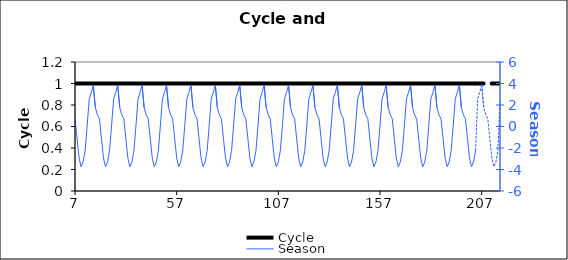
| Category | Cycle |
|---|---|
| 7.0 | 1 |
| 8.0 | 1 |
| 9.0 | 1 |
| 10.0 | 1 |
| 11.0 | 1 |
| 12.0 | 1 |
| 13.0 | 1 |
| 14.0 | 1 |
| 15.0 | 1 |
| 16.0 | 1 |
| 17.0 | 1 |
| 18.0 | 1 |
| 19.0 | 1 |
| 20.0 | 1 |
| 21.0 | 1 |
| 22.0 | 1 |
| 23.0 | 1 |
| 24.0 | 1 |
| 25.0 | 1 |
| 26.0 | 1 |
| 27.0 | 1 |
| 28.0 | 1 |
| 29.0 | 1 |
| 30.0 | 1 |
| 31.0 | 1 |
| 32.0 | 1 |
| 33.0 | 1 |
| 34.0 | 1 |
| 35.0 | 1 |
| 36.0 | 1 |
| 37.0 | 1 |
| 38.0 | 1 |
| 39.0 | 1 |
| 40.0 | 1 |
| 41.0 | 1 |
| 42.0 | 1 |
| 43.0 | 1 |
| 44.0 | 1 |
| 45.0 | 1 |
| 46.0 | 1 |
| 47.0 | 1 |
| 48.0 | 1 |
| 49.0 | 1 |
| 50.0 | 1 |
| 51.0 | 1 |
| 52.0 | 1 |
| 53.0 | 1 |
| 54.0 | 1 |
| 55.0 | 1 |
| 56.0 | 1 |
| 57.0 | 1 |
| 58.0 | 1 |
| 59.0 | 1 |
| 60.0 | 1 |
| 61.0 | 1 |
| 62.0 | 1 |
| 63.0 | 1 |
| 64.0 | 1 |
| 65.0 | 1 |
| 66.0 | 1 |
| 67.0 | 1 |
| 68.0 | 1 |
| 69.0 | 1 |
| 70.0 | 1 |
| 71.0 | 1 |
| 72.0 | 1 |
| 73.0 | 1 |
| 74.0 | 1 |
| 75.0 | 1 |
| 76.0 | 1 |
| 77.0 | 1 |
| 78.0 | 1 |
| 79.0 | 1 |
| 80.0 | 1 |
| 81.0 | 1 |
| 82.0 | 1 |
| 83.0 | 1 |
| 84.0 | 1 |
| 85.0 | 1 |
| 86.0 | 1 |
| 87.0 | 1 |
| 88.0 | 1 |
| 89.0 | 1 |
| 90.0 | 1 |
| 91.0 | 1 |
| 92.0 | 1 |
| 93.0 | 1 |
| 94.0 | 1 |
| 95.0 | 1 |
| 96.0 | 1 |
| 97.0 | 1 |
| 98.0 | 1 |
| 99.0 | 1 |
| 100.0 | 1 |
| 101.0 | 1 |
| 102.0 | 1 |
| 103.0 | 1 |
| 104.0 | 1 |
| 105.0 | 1 |
| 106.0 | 1 |
| 107.0 | 1 |
| 108.0 | 1 |
| 109.0 | 1 |
| 110.0 | 1 |
| 111.0 | 1 |
| 112.0 | 1 |
| 113.0 | 1 |
| 114.0 | 1 |
| 115.0 | 1 |
| 116.0 | 1 |
| 117.0 | 1 |
| 118.0 | 1 |
| 119.0 | 1 |
| 120.0 | 1 |
| 121.0 | 1 |
| 122.0 | 1 |
| 123.0 | 1 |
| 124.0 | 1 |
| 125.0 | 1 |
| 126.0 | 1 |
| 127.0 | 1 |
| 128.0 | 1 |
| 129.0 | 1 |
| 130.0 | 1 |
| 131.0 | 1 |
| 132.0 | 1 |
| 133.0 | 1 |
| 134.0 | 1 |
| 135.0 | 1 |
| 136.0 | 1 |
| 137.0 | 1 |
| 138.0 | 1 |
| 139.0 | 1 |
| 140.0 | 1 |
| 141.0 | 1 |
| 142.0 | 1 |
| 143.0 | 1 |
| 144.0 | 1 |
| 145.0 | 1 |
| 146.0 | 1 |
| 147.0 | 1 |
| 148.0 | 1 |
| 149.0 | 1 |
| 150.0 | 1 |
| 151.0 | 1 |
| 152.0 | 1 |
| 153.0 | 1 |
| 154.0 | 1 |
| 155.0 | 1 |
| 156.0 | 1 |
| 157.0 | 1 |
| 158.0 | 1 |
| 159.0 | 1 |
| 160.0 | 1 |
| 161.0 | 1 |
| 162.0 | 1 |
| 163.0 | 1 |
| 164.0 | 1 |
| 165.0 | 1 |
| 166.0 | 1 |
| 167.0 | 1 |
| 168.0 | 1 |
| 169.0 | 1 |
| 170.0 | 1 |
| 171.0 | 1 |
| 172.0 | 1 |
| 173.0 | 1 |
| 174.0 | 1 |
| 175.0 | 1 |
| 176.0 | 1 |
| 177.0 | 1 |
| 178.0 | 1 |
| 179.0 | 1 |
| 180.0 | 1 |
| 181.0 | 1 |
| 182.0 | 1 |
| 183.0 | 1 |
| 184.0 | 1 |
| 185.0 | 1 |
| 186.0 | 1 |
| 187.0 | 1 |
| 188.0 | 1 |
| 189.0 | 1 |
| 190.0 | 1 |
| 191.0 | 1 |
| 192.0 | 1 |
| 193.0 | 1 |
| 194.0 | 1 |
| 195.0 | 1 |
| 196.0 | 1 |
| 197.0 | 1 |
| 198.0 | 1 |
| 199.0 | 1 |
| 200.0 | 1 |
| 201.0 | 1 |
| 202.0 | 1 |
| 203.0 | 1 |
| 204.0 | 1 |
| 205.0 | 1 |
| 206.0 | 1 |
| 207.0 | 1 |
| 208.0 | 1 |
| 209.0 | 1 |
| 210.0 | 1 |
| 211.0 | 1 |
| 212.0 | 1 |
| 213.0 | 1 |
| 214.0 | 1 |
| 215.0 | 1 |
| 216.0 | 1 |